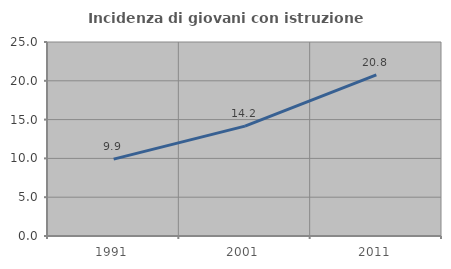
| Category | Incidenza di giovani con istruzione universitaria |
|---|---|
| 1991.0 | 9.91 |
| 2001.0 | 14.164 |
| 2011.0 | 20.769 |